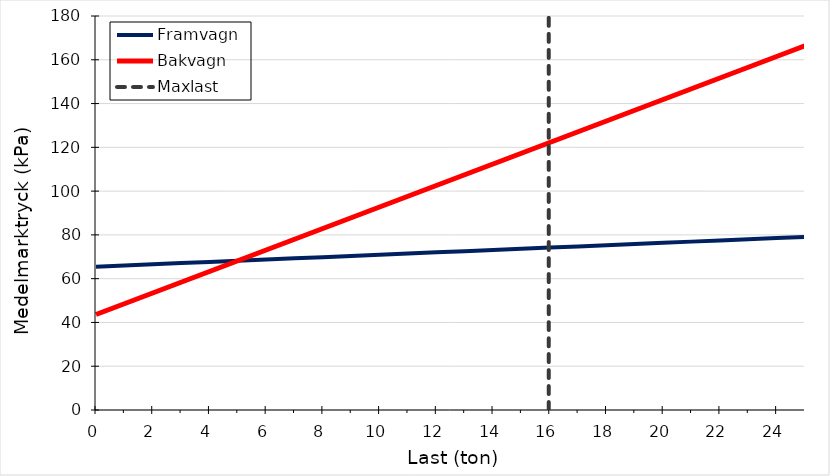
| Category | Framvagn | Bakvagn |
|---|---|---|
| 0.0 | 65.467 | 43.644 |
| 1.0 | 66.012 | 48.554 |
| 2.0 | 66.558 | 53.464 |
| 3.0 | 67.103 | 58.374 |
| 4.0 | 67.649 | 63.284 |
| 5.0 | 68.194 | 68.194 |
| 6.0 | 68.74 | 73.104 |
| 7.0 | 69.286 | 78.014 |
| 8.0 | 69.831 | 82.924 |
| 9.0 | 70.377 | 87.834 |
| 10.0 | 70.922 | 92.744 |
| 11.0 | 71.468 | 97.654 |
| 12.0 | 72.013 | 102.564 |
| 13.0 | 72.559 | 107.474 |
| 14.0 | 73.104 | 112.384 |
| 15.0 | 73.65 | 117.294 |
| 16.0 | 74.196 | 122.204 |
| 17.0 | 74.741 | 127.114 |
| 18.0 | 75.287 | 132.024 |
| 19.0 | 75.832 | 136.934 |
| 20.0 | 76.378 | 141.844 |
| 21.0 | 76.923 | 146.754 |
| 22.0 | 77.469 | 151.664 |
| 23.0 | 78.014 | 156.574 |
| 24.0 | 78.56 | 161.484 |
| 25.0 | 79.106 | 166.394 |